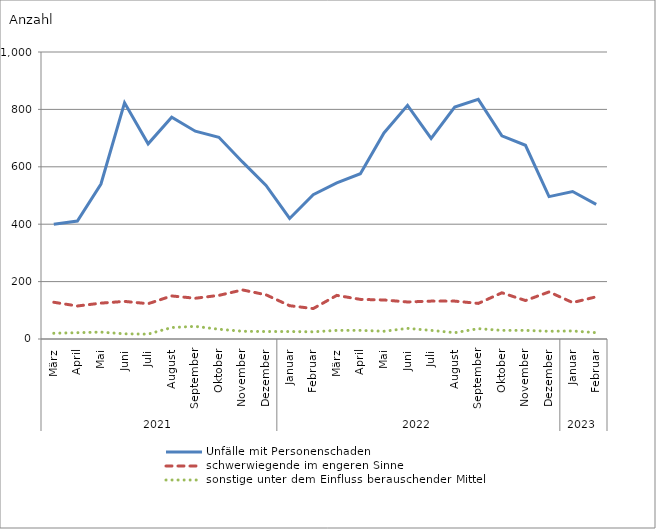
| Category | Unfälle mit Personenschaden | schwerwiegende im engeren Sinne | sonstige unter dem Einfluss berauschender Mittel |
|---|---|---|---|
| 0 | 400 | 128 | 20 |
| 1 | 411 | 115 | 22 |
| 2 | 540 | 125 | 24 |
| 3 | 823 | 131 | 18 |
| 4 | 680 | 123 | 17 |
| 5 | 773 | 150 | 40 |
| 6 | 724 | 142 | 44 |
| 7 | 703 | 152 | 34 |
| 8 | 617 | 171 | 27 |
| 9 | 535 | 154 | 26 |
| 10 | 420 | 116 | 26 |
| 11 | 503 | 106 | 25 |
| 12 | 544 | 152 | 30 |
| 13 | 576 | 138 | 30 |
| 14 | 718 | 136 | 27 |
| 15 | 814 | 129 | 37 |
| 16 | 699 | 132 | 30 |
| 17 | 808 | 132 | 22 |
| 18 | 835 | 124 | 36 |
| 19 | 708 | 161 | 30 |
| 20 | 675 | 134 | 30 |
| 21 | 496 | 164 | 27 |
| 22 | 514 | 127 | 28 |
| 23 | 469 | 147 | 22 |